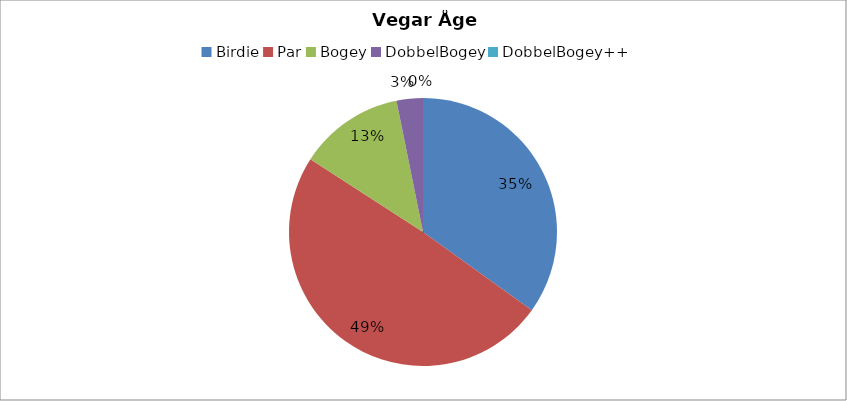
| Category | Vegar Åge Larsen |
|---|---|
| Birdie | 22 |
| Par | 31 |
| Bogey | 8 |
| DobbelBogey | 2 |
| DobbelBogey++ | 0 |